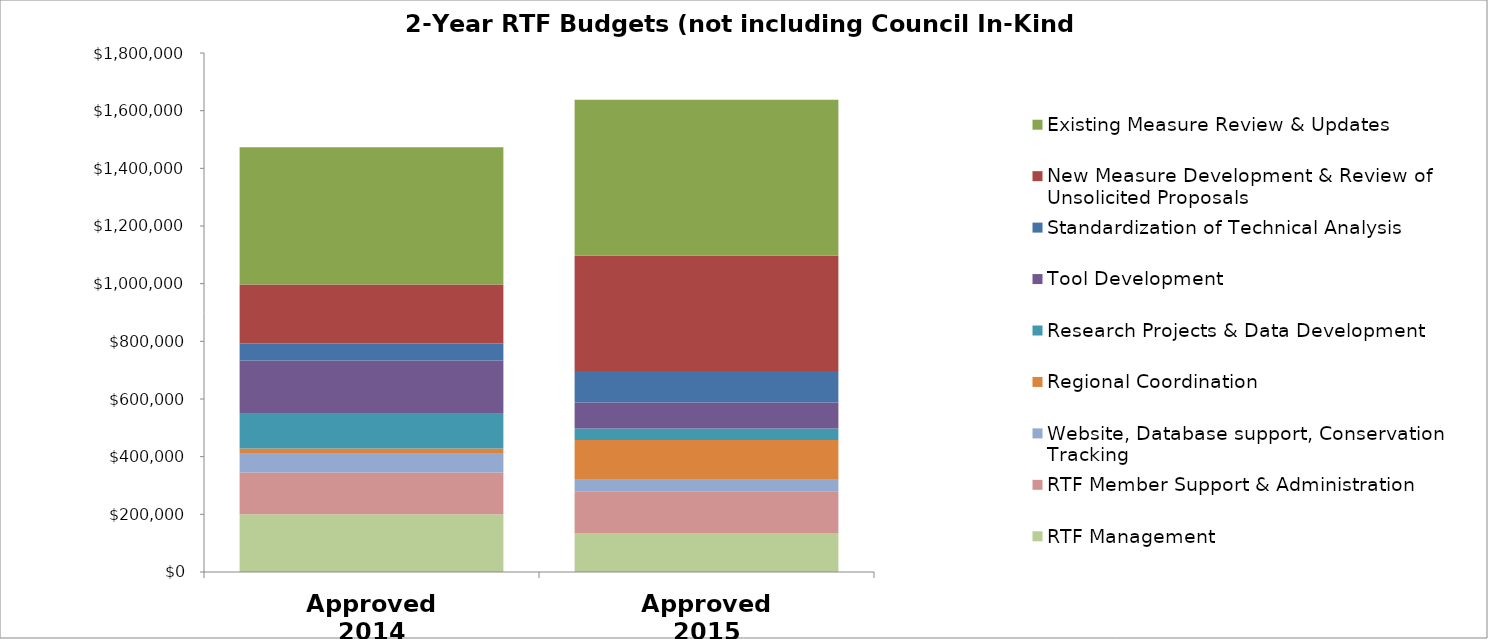
| Category | RTF Management | RTF Member Support & Administration | Website, Database support, Conservation Tracking  | Regional Coordination | Research Projects & Data Development | Tool Development | Standardization of Technical Analysis | New Measure Development & Review of Unsolicited Proposals | Existing Measure Review & Updates |
|---|---|---|---|---|---|---|---|---|---|
| Approved 2014 | 200000 | 145000 | 65000 | 18500 | 120000 | 185000 | 59000 | 205000 | 475500 |
| Approved 2015 | 133300 | 146800 | 40000 | 137500 | 40000 | 90500 | 109000 | 400000 | 540500 |